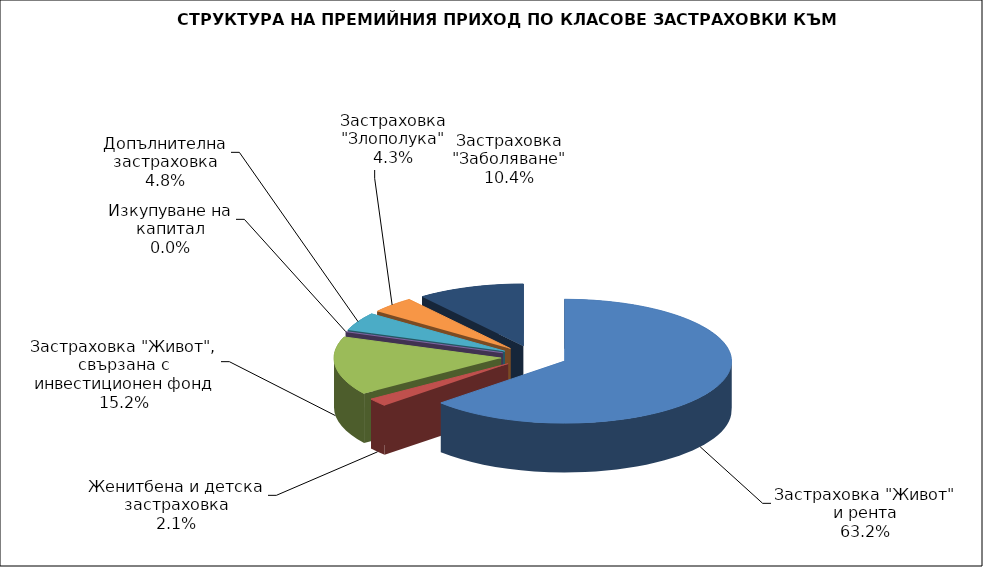
| Category | Series 0 |
|---|---|
| Застраховка "Живот" и рента | 256085658.512 |
| Женитбена и детска застраховка | 8385492.119 |
| Застраховка "Живот", свързана с инвестиционен фонд | 61725042.71 |
| Изкупуване на капитал | 0 |
| Допълнителна застраховка | 19311481.332 |
| Застраховка "Злополука" | 17477450.81 |
| Застраховка "Заболяване" | 42010144.21 |